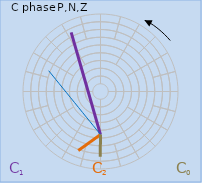
| Category | Series 0 | Series 1 | Series 2 | Series 3 | Series 4 | Series 5 | Series 6 | Series 7 | Series 8 |
|---|---|---|---|---|---|---|---|---|---|
| 0.0 | 1 | 1 | 1 | 1 | 1 | 1 | 1 | 1 | 1 |
| 0.416901582036859 | 1 | 1 | 1 | 1 | 1 | 1 | 1 | 1 | 1 |